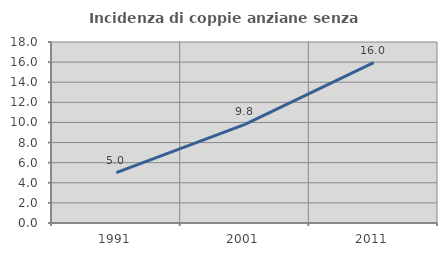
| Category | Incidenza di coppie anziane senza figli  |
|---|---|
| 1991.0 | 5.017 |
| 2001.0 | 9.801 |
| 2011.0 | 15.955 |